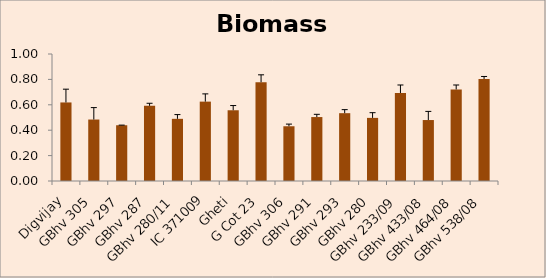
| Category | Biomass (Kg) |
|---|---|
| Digvijay | 0.618 |
| GBhv 305 | 0.484 |
| GBhv 297 | 0.439 |
| GBhv 287 | 0.592 |
| GBhv 280/11 | 0.49 |
| IC 371009 | 0.625 |
| Gheti | 0.557 |
| G Cot 23 | 0.778 |
| GBhv 306 | 0.431 |
| GBhv 291 | 0.504 |
| GBhv 293 | 0.534 |
| GBhv 280 | 0.497 |
| GBhv 233/09 | 0.693 |
| GBhv 433/08 | 0.48 |
| GBhv 464/08 | 0.721 |
| GBhv 538/08 | 0.804 |